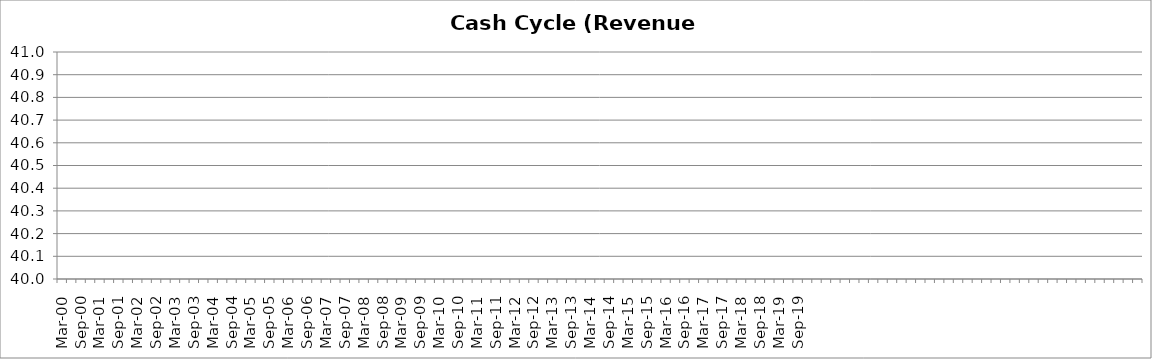
| Category | Series 0 |
|---|---|
| Mar-00 | 14.354 |
| Jun-00 | 12.687 |
| Sep-00 | 10.825 |
| Dec-00 | 14.073 |
| Mar-01 | 11.949 |
| Jun-01 | 13.024 |
| Sep-01 | 14.787 |
| Dec-01 | 13.763 |
| Mar-02 | 13.788 |
| Jun-02 | 15.408 |
| Sep-02 | 16.997 |
| Dec-02 | 18.174 |
| Mar-03 | 16.06 |
| Jun-03 | 18.06 |
| Sep-03 | 17.213 |
| Dec-03 | 17 |
| Mar-04 | 16.121 |
| Jun-04 | 15.919 |
| Sep-04 | 15.909 |
| Dec-04 | 16.512 |
| Mar-05 | 16.707 |
| Jun-05 | 15.843 |
| Sep-05 | 16.661 |
| Dec-05 | 16.133 |
| Mar-06 | 16.692 |
| Jun-06 | 18.347 |
| Sep-06 | 16.712 |
| Dec-06 | 19.487 |
| Mar-07 | 16.225 |
| Jun-07 | 12.888 |
| Sep-07 | 14.786 |
| Dec-07 | 16.149 |
| Mar-08 | 16.594 |
| Jun-08 | 17.04 |
| Sep-08 | 12.542 |
| Dec-08 | 16.751 |
| Mar-09 | 14.914 |
| Jun-09 | 14.82 |
| Sep-09 | 13.937 |
| Dec-09 | 16.239 |
| Mar-10 | 15.69 |
| Jun-10 | 15.55 |
| Sep-10 | 14.691 |
| Dec-10 | 18.661 |
| Mar-11 | 15.671 |
| Jun-11 | 14.871 |
| Sep-11 | 14.193 |
| Dec-11 | 16.542 |
| Mar-12 | 11.704 |
| Jun-12 | 15.024 |
| Sep-12 | 14.631 |
| Dec-12 | 18.169 |
| Mar-13 | 15.726 |
| Jun-13 | 14.616 |
| Sep-13 | 14.762 |
| Dec-13 | 20.988 |
| Mar-14 | 19.039 |
| Jun-14 | 19.948 |
| Sep-14 | 18.579 |
| Dec-14 | 20.809 |
| Mar-15 | 19.89 |
| Jun-15 | 19.373 |
| Sep-15 | 16.305 |
| Dec-15 | 20.697 |
| Mar-16 | 21.271 |
| Jun-16 | 23.231 |
| Sep-16 | 21.521 |
| Dec-16 | 21.028 |
| Mar-17 | 20.406 |
| Jun-17 | 19.315 |
| Sep-17 | 19.166 |
| Dec-17 | 22.051 |
| Mar-18 | 18.782 |
| Jun-18 | 16.23 |
| Sep-18 | 14.218 |
| Dec-18 | 21.984 |
| Mar-19 | 9.759 |
| Jun-19 | 9.297 |
| Sep-19 | 10.394 |